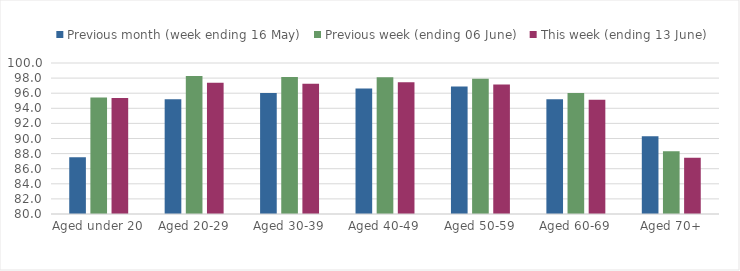
| Category | Previous month (week ending 16 May) | Previous week (ending 06 June) | This week (ending 13 June) |
|---|---|---|---|
| Aged under 20 | 87.526 | 95.437 | 95.379 |
| Aged 20-29 | 95.194 | 98.278 | 97.395 |
| Aged 30-39 | 96.038 | 98.139 | 97.236 |
| Aged 40-49 | 96.632 | 98.114 | 97.435 |
| Aged 50-59 | 96.885 | 97.906 | 97.144 |
| Aged 60-69 | 95.188 | 96.015 | 95.142 |
| Aged 70+ | 90.314 | 88.297 | 87.449 |